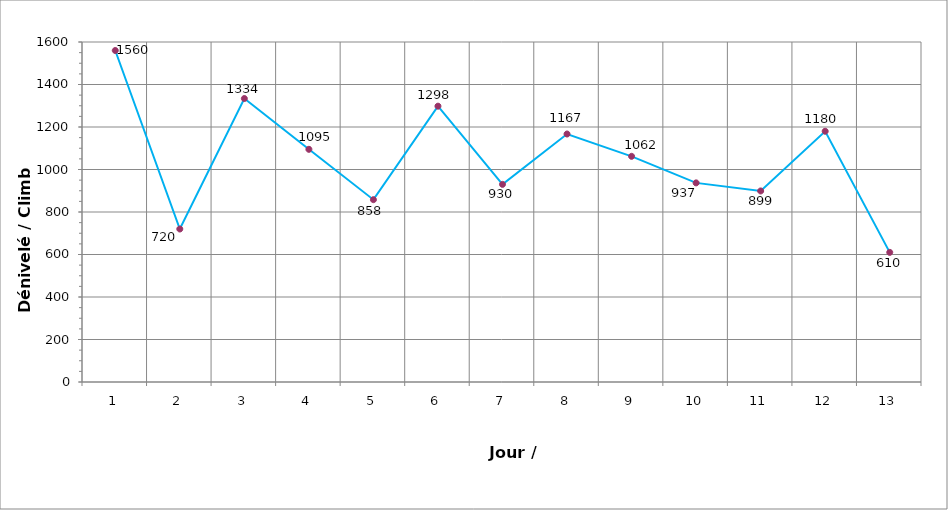
| Category | Series 0 |
|---|---|
| 0 | 1560 |
| 1 | 720 |
| 2 | 1334 |
| 3 | 1095 |
| 4 | 858 |
| 5 | 1298 |
| 6 | 930 |
| 7 | 1167 |
| 8 | 1062 |
| 9 | 937 |
| 10 | 899 |
| 11 | 1180 |
| 12 | 610 |